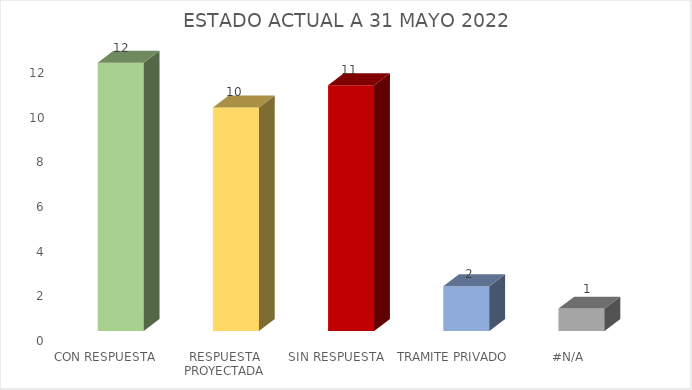
| Category | CANTIDAD |
|---|---|
| CON RESPUESTA  | 12 |
| RESPUESTA PROYECTADA | 10 |
| SIN RESPUESTA  | 11 |
| TRAMITE PRIVADO | 2 |
| #N/D | 1 |